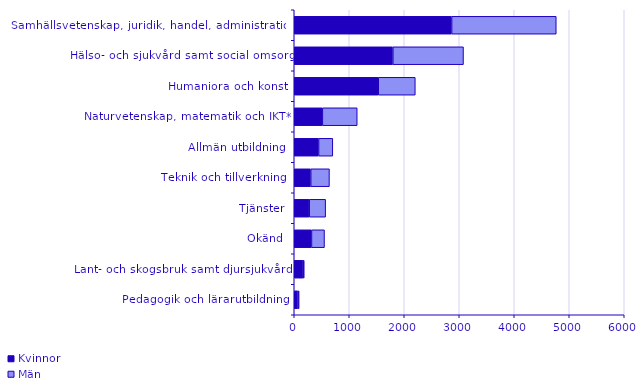
| Category | Kvinnor | Män |
|---|---|---|
| Pedagogik och lärarutbildning | 68 | 21 |
| Lant- och skogsbruk samt djursjukvård | 162 | 20 |
| Okänd | 313 | 237 |
| Tjänster | 272 | 299 |
| Teknik och tillverkning | 299 | 341 |
| Allmän utbildning | 442 | 259 |
| Naturvetenskap, matematik och IKT* | 511 | 634 |
| Humaniora och konst | 1527 | 674 |
| Hälso- och sjukvård samt social omsorg | 1792 | 1285 |
| Samhällsvetenskap, juridik, handel, administration | 2861 | 1903 |